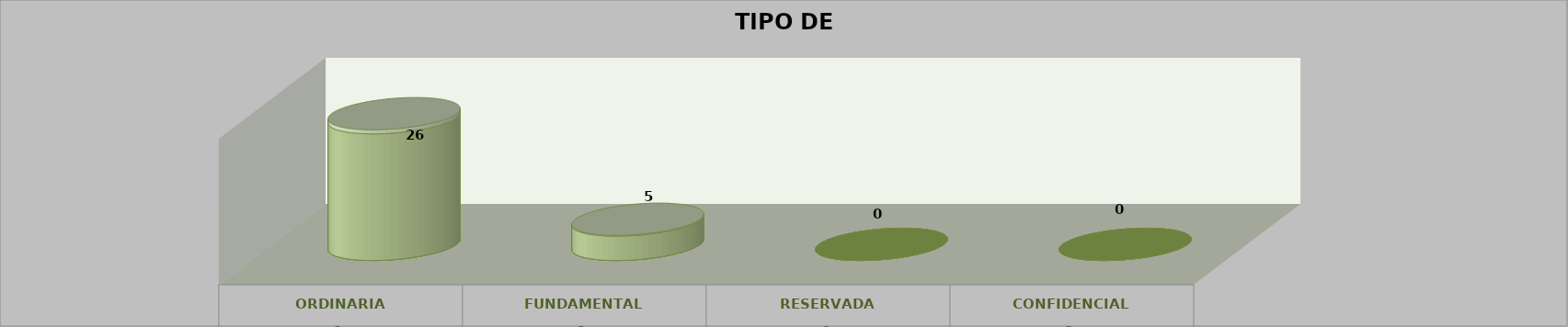
| Category | Series 0 | Series 2 | Series 1 | Series 3 | Series 4 |
|---|---|---|---|---|---|
| 0 |  |  |  | 26 | 0.839 |
| 1 |  |  |  | 5 | 0.161 |
| 2 |  |  |  | 0 | 0 |
| 3 |  |  |  | 0 | 0 |